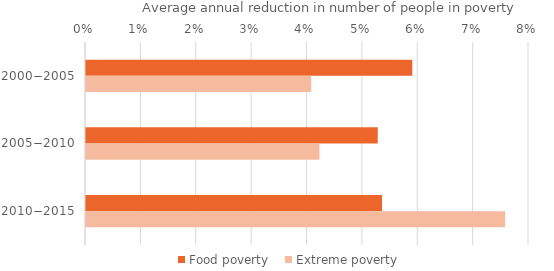
| Category | Food poverty | Extreme poverty |
|---|---|---|
| 2000−2005 | 0.059 | 0.041 |
| 2005−2010 | 0.053 | 0.042 |
| 2010−2015 | 0.053 | 0.076 |